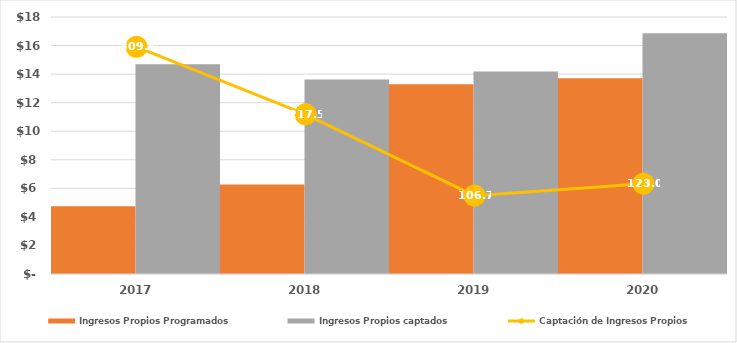
| Category | Ingresos Propios Programados | Ingresos Propios captados |
|---|---|---|
| 2017.0 | 4746.7 | 14685.3 |
| 2018.0 | 6263.7 | 13623.8 |
| 2019.0 | 13294.425 | 14184.195 |
| 2020.0 | 13709.89 | 16857.194 |